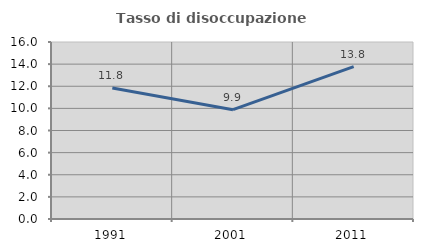
| Category | Tasso di disoccupazione giovanile  |
|---|---|
| 1991.0 | 11.834 |
| 2001.0 | 9.881 |
| 2011.0 | 13.778 |